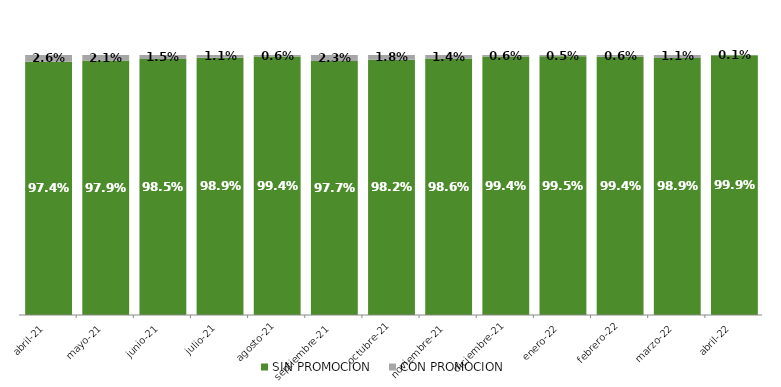
| Category | SIN PROMOCION   | CON PROMOCION   |
|---|---|---|
| 2021-04-01 | 0.974 | 0.026 |
| 2021-05-01 | 0.979 | 0.021 |
| 2021-06-01 | 0.985 | 0.015 |
| 2021-07-01 | 0.989 | 0.011 |
| 2021-08-01 | 0.994 | 0.006 |
| 2021-09-01 | 0.977 | 0.023 |
| 2021-10-01 | 0.982 | 0.018 |
| 2021-11-01 | 0.986 | 0.014 |
| 2021-12-01 | 0.994 | 0.006 |
| 2022-01-01 | 0.995 | 0.005 |
| 2022-02-01 | 0.994 | 0.006 |
| 2022-03-01 | 0.989 | 0.011 |
| 2022-04-01 | 0.999 | 0.001 |